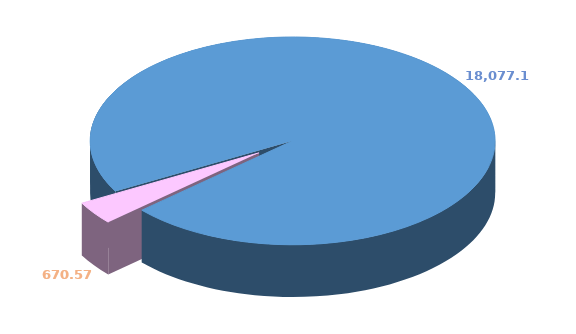
| Category | Series 0 |
|---|---|
| 0 | 18077.125 |
| 1 | 670.569 |